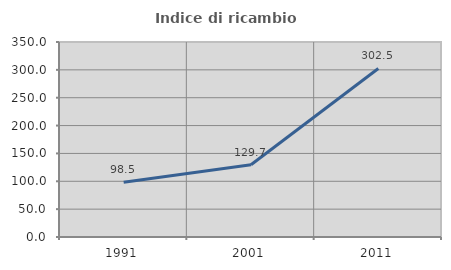
| Category | Indice di ricambio occupazionale  |
|---|---|
| 1991.0 | 98.462 |
| 2001.0 | 129.73 |
| 2011.0 | 302.532 |